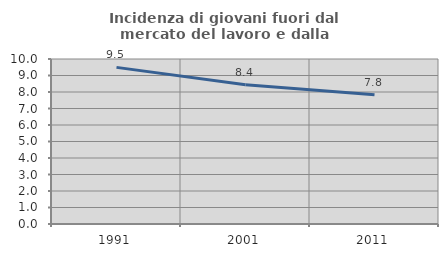
| Category | Incidenza di giovani fuori dal mercato del lavoro e dalla formazione  |
|---|---|
| 1991.0 | 9.492 |
| 2001.0 | 8.446 |
| 2011.0 | 7.834 |